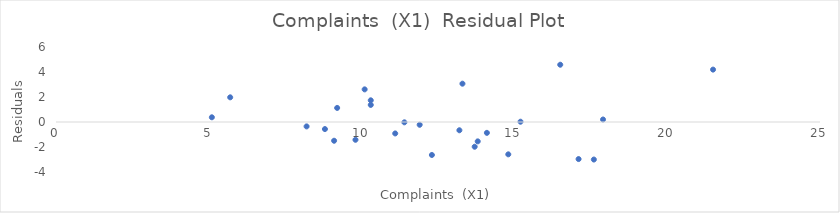
| Category | Series 0 |
|---|---|
| 9.8 | -1.422 |
| 8.2 | -0.353 |
| 16.5 | 4.582 |
| 11.4 | -0.026 |
| 17.9 | 0.2 |
| 5.1 | 0.377 |
| 21.5 | 4.192 |
| 10.1 | 2.61 |
| 13.7 | -1.978 |
| 14.1 | -0.868 |
| 17.6 | -3.003 |
| 5.7 | 1.975 |
| 10.3 | 1.735 |
| 11.1 | -0.916 |
| 14.8 | -2.587 |
| 15.2 | 0.023 |
| 9.1 | -1.499 |
| 13.3 | 3.065 |
| 17.1 | -2.965 |
| 13.2 | -0.662 |
| 8.8 | -0.565 |
| 9.2 | 1.126 |
| 11.9 | -0.222 |
| 13.8 | -1.549 |
| 10.3 | 1.367 |
| 12.3 | -2.638 |